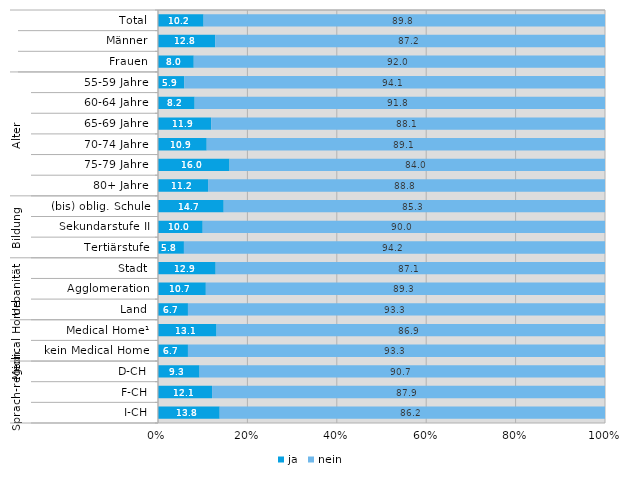
| Category | ja | nein |
|---|---|---|
| 0 | 10.2 | 89.8 |
| 1 | 12.8 | 87.2 |
| 2 | 8 | 92 |
| 3 | 5.9 | 94.1 |
| 4 | 8.2 | 91.8 |
| 5 | 11.9 | 88.1 |
| 6 | 10.9 | 89.1 |
| 7 | 16 | 84 |
| 8 | 11.2 | 88.8 |
| 9 | 14.7 | 85.3 |
| 10 | 10 | 90 |
| 11 | 5.8 | 94.2 |
| 12 | 12.9 | 87.1 |
| 13 | 10.7 | 89.3 |
| 14 | 6.7 | 93.3 |
| 15 | 13.1 | 86.9 |
| 16 | 6.7 | 93.3 |
| 17 | 9.3 | 90.7 |
| 18 | 12.1 | 87.9 |
| 19 | 13.8 | 86.2 |